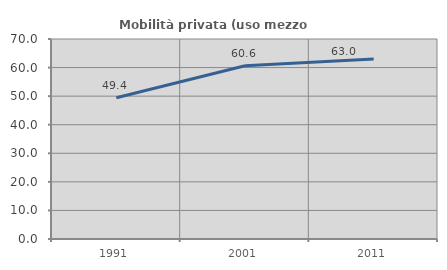
| Category | Mobilità privata (uso mezzo privato) |
|---|---|
| 1991.0 | 49.42 |
| 2001.0 | 60.642 |
| 2011.0 | 63.01 |